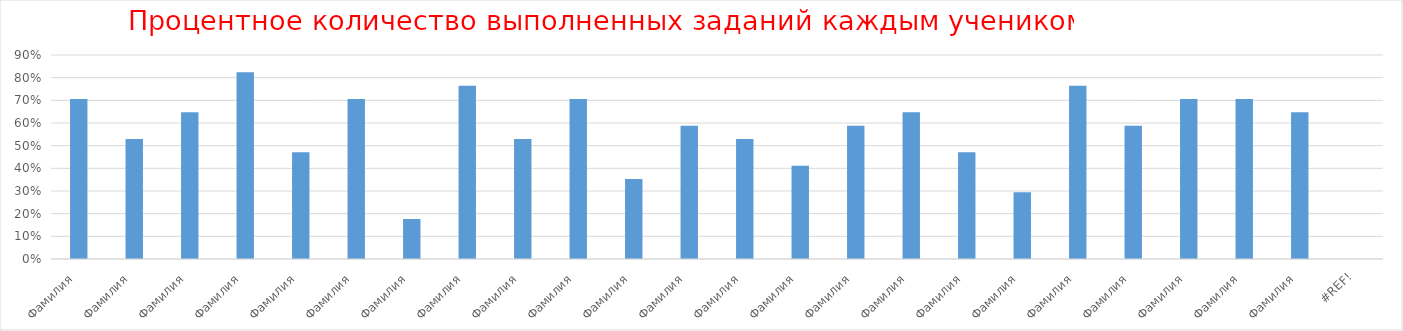
| Category | Series 0 |
|---|---|
| Фамилия  | 0.706 |
| Фамилия  | 0.529 |
| Фамилия  | 0.647 |
| Фамилия  | 0.824 |
| Фамилия  | 0.471 |
| Фамилия  | 0.706 |
| Фамилия  | 0.176 |
| Фамилия  | 0.765 |
| Фамилия  | 0.529 |
| Фамилия  | 0.706 |
| Фамилия  | 0.353 |
| Фамилия  | 0.588 |
| Фамилия  | 0.529 |
| Фамилия  | 0.412 |
| Фамилия  | 0.588 |
| Фамилия  | 0.647 |
| Фамилия  | 0.471 |
| Фамилия  | 0.294 |
| Фамилия  | 0.765 |
| Фамилия  | 0.588 |
| Фамилия  | 0.706 |
| Фамилия  | 0.706 |
| Фамилия  | 0.647 |
| #ССЫЛКА! | 0 |